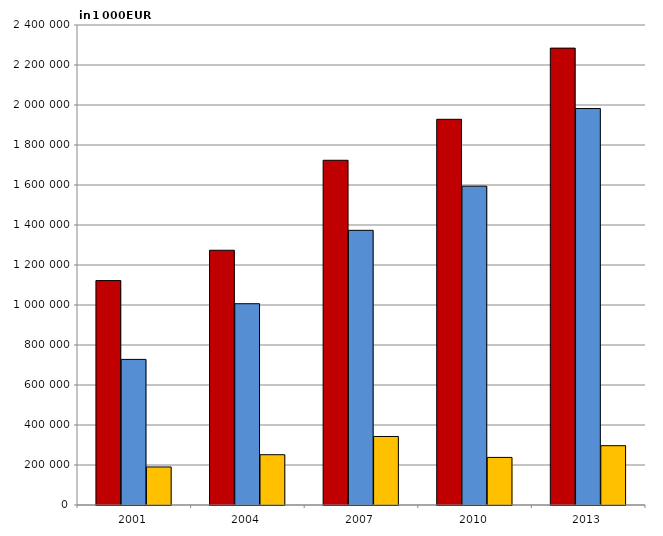
| Category | Gesamtbetrag der Einkünfte | zu versteuerndes Einkommen | festgesetzte Körperschaftsteuer |
|---|---|---|---|
| 2001.0 | 1122101 | 728026 | 190282 |
| 2004.0 | 1273716 | 1006419 | 251427 |
| 2007.0 | 1723620 | 1373401 | 342606 |
| 2010.0 | 1928489 | 1594140 | 237968 |
| 2013.0 | 2284445 | 1982348 | 296602 |